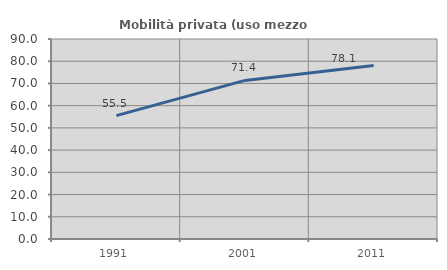
| Category | Mobilità privata (uso mezzo privato) |
|---|---|
| 1991.0 | 55.509 |
| 2001.0 | 71.374 |
| 2011.0 | 78.082 |